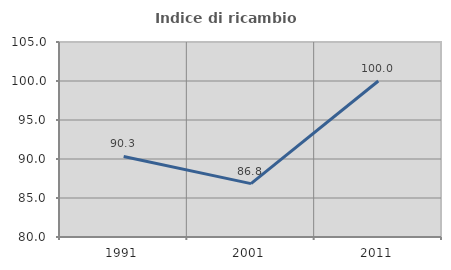
| Category | Indice di ricambio occupazionale  |
|---|---|
| 1991.0 | 90.323 |
| 2001.0 | 86.842 |
| 2011.0 | 100 |